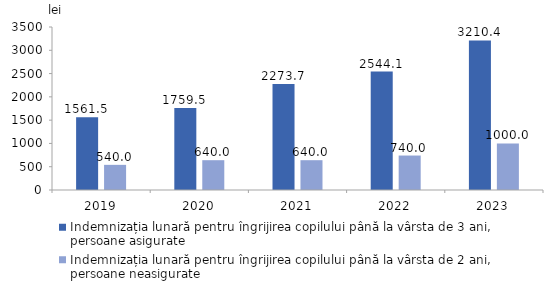
| Category | Indemnizația lunară pentru îngrijirea copilului până la vârsta de 3 ani, persoane asigurate | Indemnizația lunară pentru îngrijirea copilului până la vârsta de 2 ani, persoane neasigurate |
|---|---|---|
| 2019.0 | 1561.5 | 540 |
| 2020.0 | 1759.5 | 640 |
| 2021.0 | 2273.7 | 640 |
| 2022.0 | 2544.1 | 740 |
| 2023.0 | 3210.4 | 1000 |